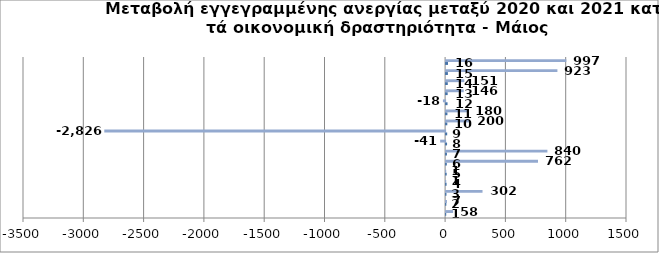
| Category | Series 0 | Series 1 |
|---|---|---|
| 0 | 1 | 58 |
| 1 | 2 | 7 |
| 2 | 3 | 302 |
| 3 | 4 | 1 |
| 4 | 5 | 1 |
| 5 | 6 | 762 |
| 6 | 7 | 840 |
| 7 | 8 | -41 |
| 8 | 9 | -2826 |
| 9 | 10 | 200 |
| 10 | 11 | 180 |
| 11 | 12 | -18 |
| 12 | 13 | 146 |
| 13 | 14 | 151 |
| 14 | 15 | 923 |
| 15 | 16 | 997 |